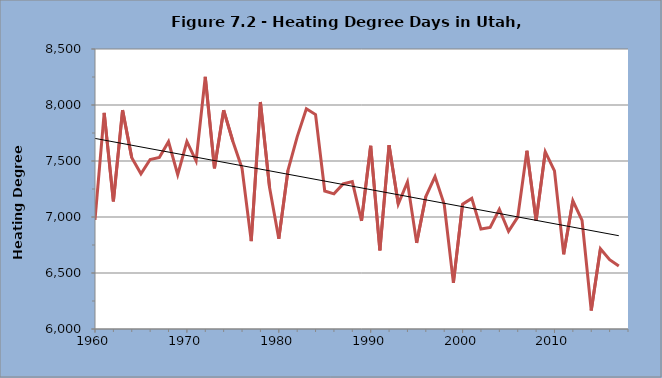
| Category | Series 0 |
|---|---|
| 1960.0 | 6974 |
| 1961.0 | 7929 |
| 1962.0 | 7139 |
| 1963.0 | 7954 |
| 1964.0 | 7529 |
| 1965.0 | 7386 |
| 1966.0 | 7513 |
| 1967.0 | 7532 |
| 1968.0 | 7673 |
| 1969.0 | 7378 |
| 1970.0 | 7674 |
| 1971.0 | 7501 |
| 1972.0 | 8252 |
| 1973.0 | 7435 |
| 1974.0 | 7954 |
| 1975.0 | 7676 |
| 1976.0 | 7435 |
| 1977.0 | 6785 |
| 1978.0 | 8027 |
| 1979.0 | 7261 |
| 1980.0 | 6806 |
| 1981.0 | 7416 |
| 1982.0 | 7716 |
| 1983.0 | 7966 |
| 1984.0 | 7915 |
| 1985.0 | 7232 |
| 1986.0 | 7207 |
| 1987.0 | 7295 |
| 1988.0 | 7316 |
| 1989.0 | 6965 |
| 1990.0 | 7636 |
| 1991.0 | 6703 |
| 1992.0 | 7641 |
| 1993.0 | 7116 |
| 1994.0 | 7313 |
| 1995.0 | 6769 |
| 1996.0 | 7183 |
| 1997.0 | 7361 |
| 1998.0 | 7114 |
| 1999.0 | 6412 |
| 2000.0 | 7115 |
| 2001.0 | 7166 |
| 2002.0 | 6892 |
| 2003.0 | 6907 |
| 2004.0 | 7069 |
| 2005.0 | 6873 |
| 2006.0 | 6999 |
| 2007.0 | 7592 |
| 2008.0 | 6968 |
| 2009.0 | 7582 |
| 2010.0 | 7412 |
| 2011.0 | 6667 |
| 2012.0 | 7145 |
| 2013.0 | 6970 |
| 2014.0 | 6165 |
| 2015.0 | 6717 |
| 2016.0 | 6619 |
| 2017.0 | 6562 |